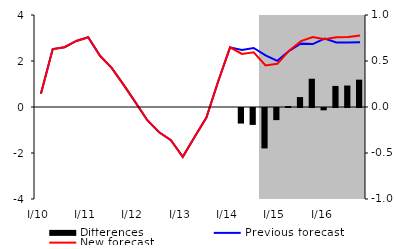
| Category | Differences |
|---|---|
| 0 | 0 |
| 1 | 0 |
| 2 | 0 |
| 3 | 0 |
| 4 | 0 |
| 5 | 0 |
| 6 | 0 |
| 7 | 0 |
| 8 | 0 |
| 9 | 0 |
| 10 | 0 |
| 11 | 0 |
| 12 | 0 |
| 13 | 0 |
| 14 | 0 |
| 15 | 0 |
| 16 | 0 |
| 17 | -0.169 |
| 18 | -0.184 |
| 19 | -0.439 |
| 20 | -0.132 |
| 21 | 0.01 |
| 22 | 0.108 |
| 23 | 0.307 |
| 24 | -0.025 |
| 25 | 0.229 |
| 26 | 0.233 |
| 27 | 0.297 |